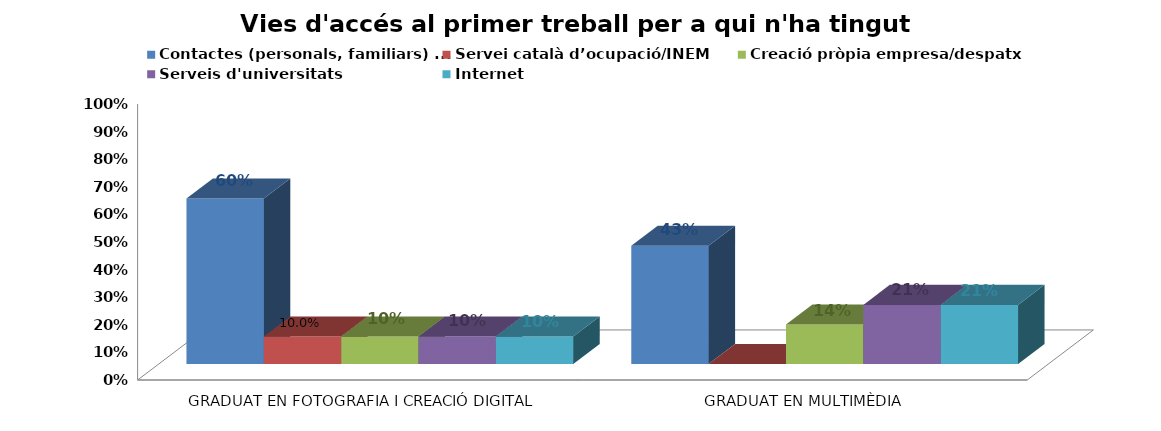
| Category | Contactes (personals, familiars) ... | Servei català d’ocupació/INEM | Creació pròpia empresa/despatx | Serveis d'universitats | Internet |
|---|---|---|---|---|---|
| GRADUAT EN FOTOGRAFIA I CREACIÓ DIGITAL | 0.6 | 0.1 | 0.1 | 0.1 | 0.1 |
| GRADUAT EN MULTIMÈDIA | 0.429 | 0 | 0.143 | 0.214 | 0.214 |